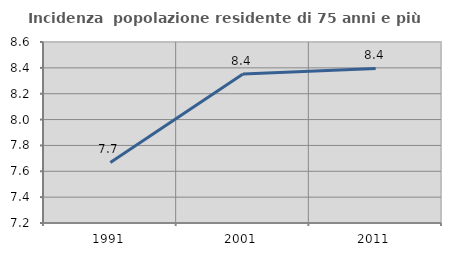
| Category | Incidenza  popolazione residente di 75 anni e più |
|---|---|
| 1991.0 | 7.668 |
| 2001.0 | 8.353 |
| 2011.0 | 8.395 |